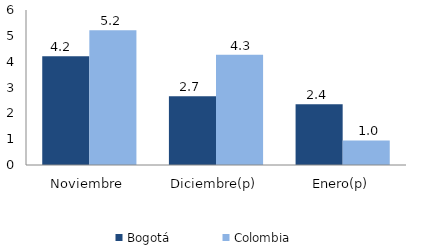
| Category | Bogotá | Colombia |
|---|---|---|
| Noviembre | 4.213 | 5.213 |
| Diciembre(p) | 2.661 | 4.268 |
| Enero(p) | 2.356 | 0.951 |